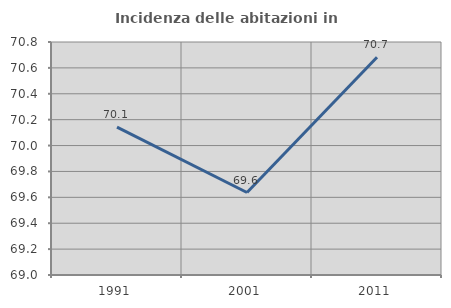
| Category | Incidenza delle abitazioni in proprietà  |
|---|---|
| 1991.0 | 70.142 |
| 2001.0 | 69.637 |
| 2011.0 | 70.682 |